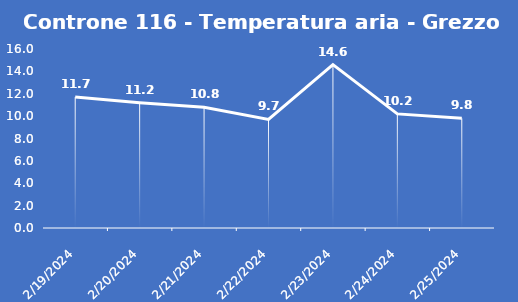
| Category | Controne 116 - Temperatura aria - Grezzo (°C) |
|---|---|
| 2/19/24 | 11.7 |
| 2/20/24 | 11.2 |
| 2/21/24 | 10.8 |
| 2/22/24 | 9.7 |
| 2/23/24 | 14.6 |
| 2/24/24 | 10.2 |
| 2/25/24 | 9.8 |